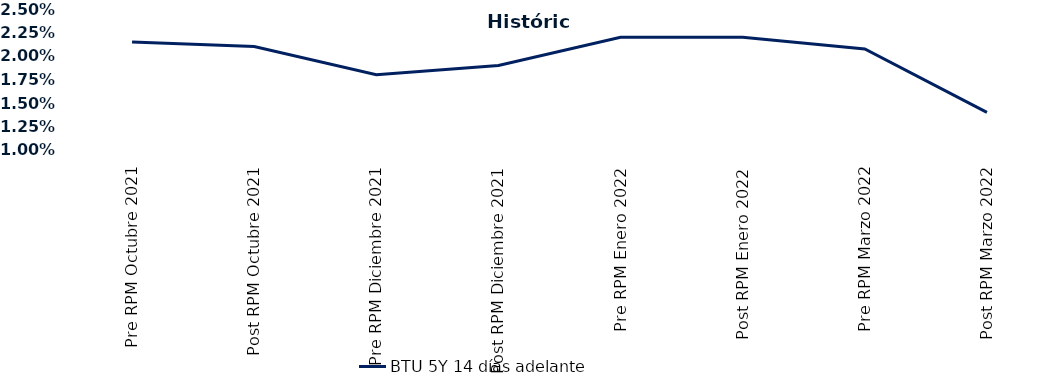
| Category | BTU 5Y 14 días adelante |
|---|---|
| Pre RPM Octubre 2021 | 0.022 |
| Post RPM Octubre 2021 | 0.021 |
| Pre RPM Diciembre 2021 | 0.018 |
| Post RPM Diciembre 2021 | 0.019 |
| Pre RPM Enero 2022 | 0.022 |
| Post RPM Enero 2022 | 0.022 |
| Pre RPM Marzo 2022 | 0.021 |
| Post RPM Marzo 2022 | 0.014 |